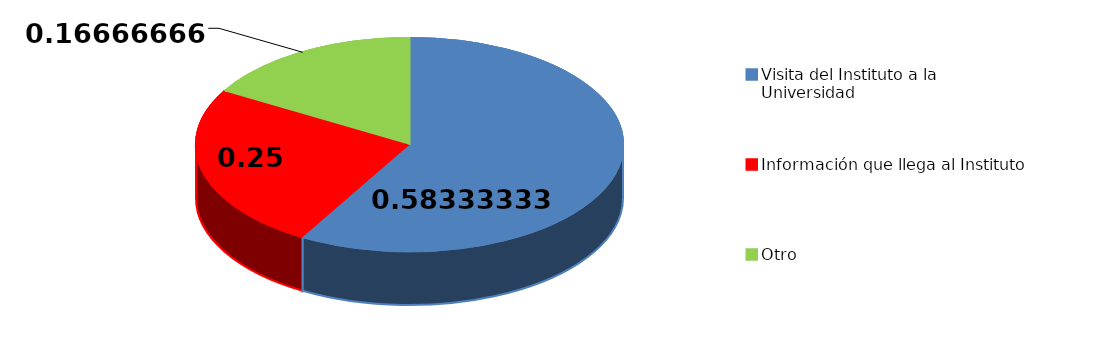
| Category | Series 0 | Series 1 |
|---|---|---|
| Visita del Instituto a la Universidad | 7 | 96 |
| Información que llega al Instituto | 3 | 97 |
| Otro | 2 | 98 |